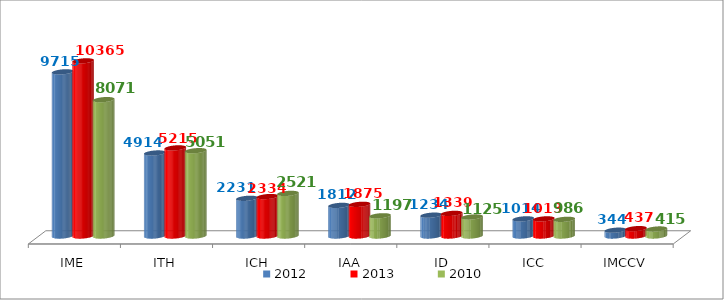
| Category | 2012 | 2013 | 2010 |
|---|---|---|---|
| IME | 9714.8 | 10364.6 | 8070.9 |
| ITH | 4913.5 | 5214.59 | 5050.5 |
| ICH | 2231.165 | 2333.968 | 2521.3 |
| IAA | 1811.783 | 1875.307 | 1196.9 |
| ID | 1233.541 | 1338.857 | 1125.3 |
| ICC | 1014.3 | 1012.56 | 985.9 |
| IMCCV | 343.584 | 436.766 | 415.1 |